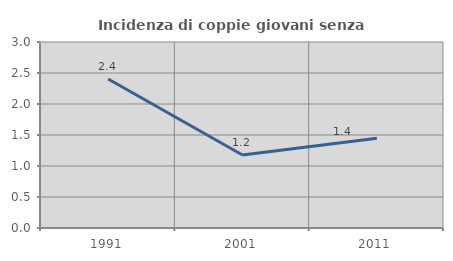
| Category | Incidenza di coppie giovani senza figli |
|---|---|
| 1991.0 | 2.404 |
| 2001.0 | 1.176 |
| 2011.0 | 1.449 |